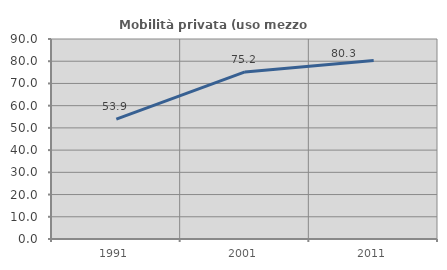
| Category | Mobilità privata (uso mezzo privato) |
|---|---|
| 1991.0 | 53.927 |
| 2001.0 | 75.189 |
| 2011.0 | 80.337 |